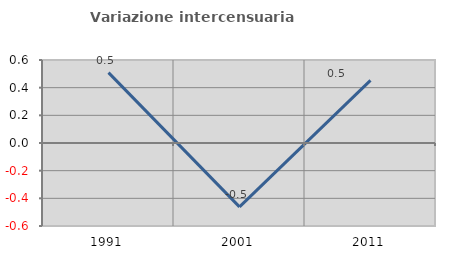
| Category | Variazione intercensuaria annua |
|---|---|
| 1991.0 | 0.508 |
| 2001.0 | -0.462 |
| 2011.0 | 0.452 |